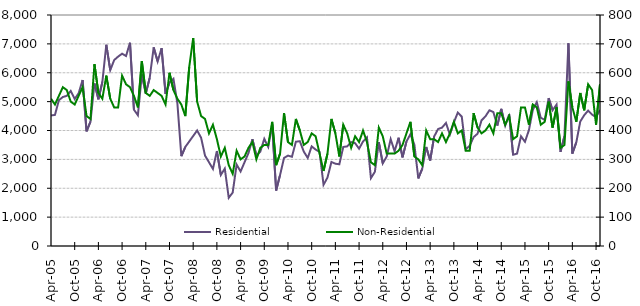
| Category | Residential |
|---|---|
| 2005-04-01 | 4520 |
| 2005-05-01 | 4540 |
| 2005-06-01 | 5050 |
| 2005-07-01 | 5160 |
| 2005-08-01 | 5200 |
| 2005-09-01 | 5370 |
| 2005-10-01 | 5090 |
| 2005-11-01 | 5290 |
| 2005-12-01 | 5750 |
| 2006-01-01 | 3970 |
| 2006-02-01 | 4310 |
| 2006-03-01 | 5630 |
| 2006-04-01 | 5080 |
| 2006-05-01 | 5680 |
| 2006-06-01 | 6970 |
| 2006-07-01 | 6090 |
| 2006-08-01 | 6440 |
| 2006-09-01 | 6560 |
| 2006-10-01 | 6660 |
| 2006-11-01 | 6580 |
| 2006-12-01 | 7040 |
| 2007-01-01 | 4720 |
| 2007-02-01 | 4530 |
| 2007-03-01 | 5940 |
| 2007-04-01 | 5280 |
| 2007-05-01 | 5830 |
| 2007-06-01 | 6880 |
| 2007-07-01 | 6390 |
| 2007-08-01 | 6850 |
| 2007-09-01 | 5270 |
| 2007-10-01 | 5660 |
| 2007-11-01 | 5790 |
| 2007-12-01 | 4940 |
| 2008-01-01 | 3110 |
| 2008-02-01 | 3430 |
| 2008-03-01 | 3620 |
| 2008-04-01 | 3810 |
| 2008-05-01 | 4000 |
| 2008-06-01 | 3750 |
| 2008-07-01 | 3130 |
| 2008-08-01 | 2900 |
| 2008-09-01 | 2670 |
| 2008-10-01 | 3290 |
| 2008-11-01 | 2460 |
| 2008-12-01 | 2680 |
| 2009-01-01 | 1670 |
| 2009-02-01 | 1850 |
| 2009-03-01 | 2820 |
| 2009-04-01 | 2580 |
| 2009-05-01 | 2900 |
| 2009-06-01 | 3220 |
| 2009-07-01 | 3700 |
| 2009-08-01 | 3130 |
| 2009-09-01 | 3270 |
| 2009-10-01 | 3710 |
| 2009-11-01 | 3430 |
| 2009-12-01 | 4210 |
| 2010-01-01 | 1920 |
| 2010-02-01 | 2460 |
| 2010-03-01 | 3050 |
| 2010-04-01 | 3130 |
| 2010-05-01 | 3090 |
| 2010-06-01 | 3610 |
| 2010-07-01 | 3630 |
| 2010-08-01 | 3270 |
| 2010-09-01 | 3050 |
| 2010-10-01 | 3450 |
| 2010-11-01 | 3340 |
| 2010-12-01 | 3260 |
| 2011-01-01 | 2120 |
| 2011-02-01 | 2370 |
| 2011-03-01 | 2910 |
| 2011-04-01 | 2850 |
| 2011-05-01 | 2830 |
| 2011-06-01 | 3430 |
| 2011-07-01 | 3450 |
| 2011-08-01 | 3600 |
| 2011-09-01 | 3560 |
| 2011-10-01 | 3370 |
| 2011-11-01 | 3620 |
| 2011-12-01 | 3760 |
| 2012-01-01 | 2350 |
| 2012-02-01 | 2570 |
| 2012-03-01 | 3600 |
| 2012-04-01 | 2860 |
| 2012-05-01 | 3100 |
| 2012-06-01 | 3700 |
| 2012-07-01 | 3280 |
| 2012-08-01 | 3750 |
| 2012-09-01 | 3070 |
| 2012-10-01 | 3620 |
| 2012-11-01 | 3870 |
| 2012-12-01 | 3510 |
| 2013-01-01 | 2340 |
| 2013-02-01 | 2680 |
| 2013-03-01 | 3430 |
| 2013-04-01 | 2960 |
| 2013-05-01 | 3790 |
| 2013-06-01 | 4050 |
| 2013-07-01 | 4100 |
| 2013-08-01 | 4260 |
| 2013-09-01 | 3860 |
| 2013-10-01 | 4280 |
| 2013-11-01 | 4620 |
| 2013-12-01 | 4480 |
| 2014-01-01 | 3350 |
| 2014-02-01 | 3470 |
| 2014-03-01 | 3770 |
| 2014-04-01 | 3890 |
| 2014-05-01 | 4350 |
| 2014-06-01 | 4490 |
| 2014-07-01 | 4700 |
| 2014-08-01 | 4640 |
| 2014-09-01 | 4170 |
| 2014-10-01 | 4750 |
| 2014-11-01 | 4170 |
| 2014-12-01 | 4560 |
| 2015-01-01 | 3160 |
| 2015-02-01 | 3200 |
| 2015-03-01 | 3800 |
| 2015-04-01 | 3610 |
| 2015-05-01 | 4010 |
| 2015-06-01 | 4720 |
| 2015-07-01 | 4980 |
| 2015-08-01 | 4440 |
| 2015-09-01 | 4370 |
| 2015-10-01 | 5120 |
| 2015-11-01 | 4700 |
| 2015-12-01 | 4900 |
| 2016-01-01 | 3260 |
| 2016-02-01 | 3810 |
| 2016-03-01 | 7020 |
| 2016-04-01 | 3200 |
| 2016-05-01 | 3590 |
| 2016-06-01 | 4310 |
| 2016-07-01 | 4530 |
| 2016-08-01 | 4690 |
| 2016-09-01 | 4550 |
| 2016-10-01 | 4460 |
| 2016-11-01 | 4710 |